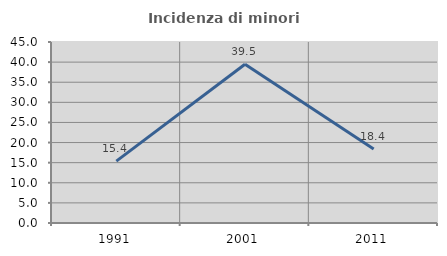
| Category | Incidenza di minori stranieri |
|---|---|
| 1991.0 | 15.385 |
| 2001.0 | 39.474 |
| 2011.0 | 18.367 |